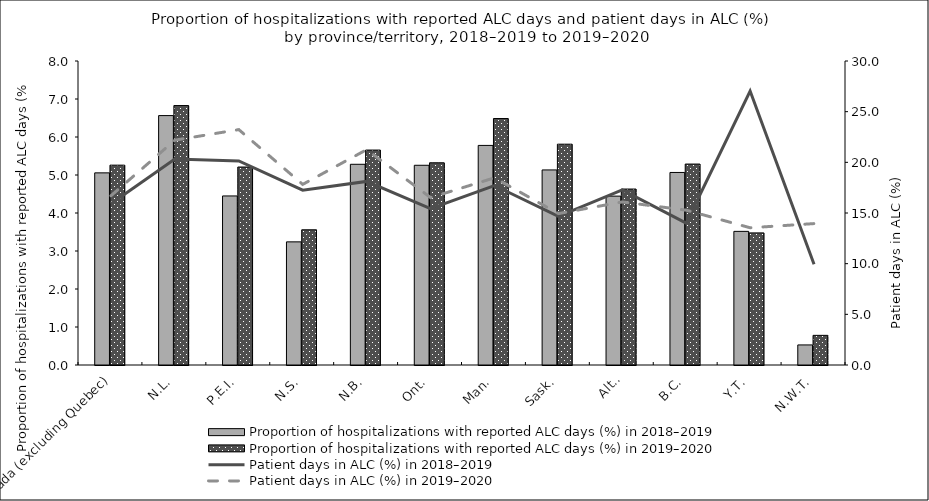
| Category | Proportion of hospitalizations with reported ALC days (%) in 2018–2019 | Proportion of hospitalizations with reported ALC days (%) in 2019–2020 |
|---|---|---|
| Canada (excluding Quebec) | 5.056 | 5.259 |
| N.L. | 6.563 | 6.828 |
| P.E.I. | 4.449 | 5.21 |
| N.S. | 3.24 | 3.558 |
| N.B. | 5.282 | 5.656 |
| Ont. | 5.256 | 5.322 |
| Man. | 5.779 | 6.486 |
| Sask. | 5.134 | 5.811 |
| Alta. | 4.444 | 4.631 |
| B.C. | 5.067 | 5.288 |
| Y.T. | 3.517 | 3.477 |
| N.W.T. | 0.528 | 0.78 |